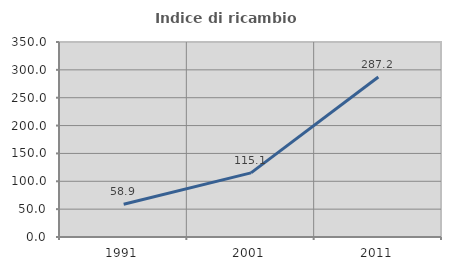
| Category | Indice di ricambio occupazionale  |
|---|---|
| 1991.0 | 58.868 |
| 2001.0 | 115.138 |
| 2011.0 | 287.179 |